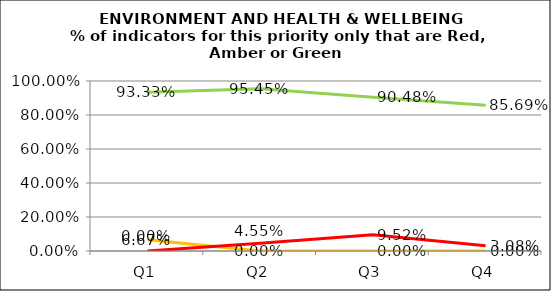
| Category | Green | Amber | Red |
|---|---|---|---|
| Q1 | 0.933 | 0.067 | 0 |
| Q2 | 0.955 | 0 | 0.045 |
| Q3 | 0.905 | 0 | 0.095 |
| Q4 | 0.857 | 0 | 0.031 |